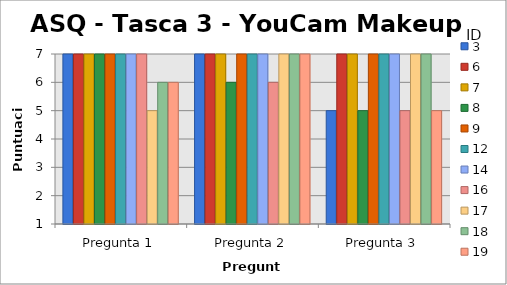
| Category | 3 | 6 | 7 | 8 | 9 | 12 | 14 | 16 | 17 | 18 | 19 |
|---|---|---|---|---|---|---|---|---|---|---|---|
| Pregunta 1 | 7 | 7 | 7 | 7 | 7 | 7 | 7 | 7 | 5 | 6 | 6 |
| Pregunta 2 | 7 | 7 | 7 | 6 | 7 | 7 | 7 | 6 | 7 | 7 | 7 |
| Pregunta 3 | 5 | 7 | 7 | 5 | 7 | 7 | 7 | 5 | 7 | 7 | 5 |